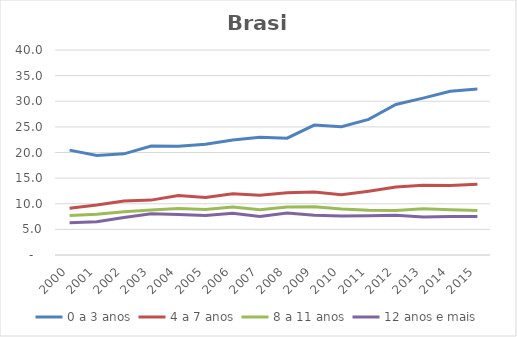
| Category | 0 a 3 anos | 4 a 7 anos | 8 a 11 anos | 12 anos e mais |
|---|---|---|---|---|
| 2000.0 | 20.462 | 9.128 | 7.684 | 6.315 |
| 2001.0 | 19.417 | 9.741 | 7.966 | 6.501 |
| 2002.0 | 19.741 | 10.521 | 8.433 | 7.336 |
| 2003.0 | 21.258 | 10.709 | 8.758 | 8.034 |
| 2004.0 | 21.199 | 11.629 | 9.082 | 7.885 |
| 2005.0 | 21.596 | 11.218 | 8.863 | 7.71 |
| 2006.0 | 22.421 | 11.971 | 9.379 | 8.155 |
| 2007.0 | 22.979 | 11.641 | 8.83 | 7.535 |
| 2008.0 | 22.8 | 12.14 | 9.384 | 8.21 |
| 2009.0 | 25.342 | 12.285 | 9.415 | 7.77 |
| 2010.0 | 25.026 | 11.742 | 8.987 | 7.621 |
| 2011.0 | 26.459 | 12.457 | 8.722 | 7.653 |
| 2012.0 | 29.38 | 13.267 | 8.686 | 7.754 |
| 2013.0 | 30.608 | 13.591 | 9.027 | 7.418 |
| 2014.0 | 31.941 | 13.548 | 8.85 | 7.536 |
| 2015.0 | 32.382 | 13.797 | 8.663 | 7.526 |